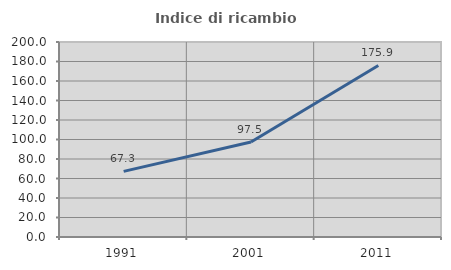
| Category | Indice di ricambio occupazionale  |
|---|---|
| 1991.0 | 67.288 |
| 2001.0 | 97.507 |
| 2011.0 | 175.898 |